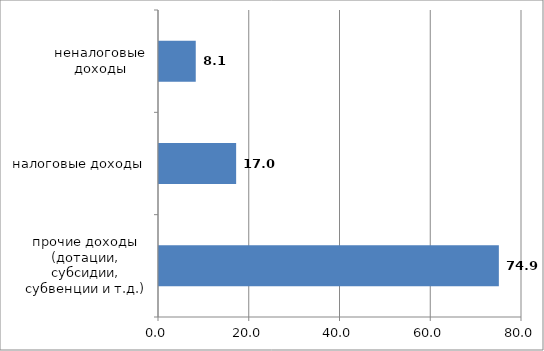
| Category | Series 0 |
|---|---|
| прочие доходы (дотации, субсидии, субвенции и т.д.) | 74.9 |
| налоговые доходы | 17 |
| неналоговые доходы | 8.1 |